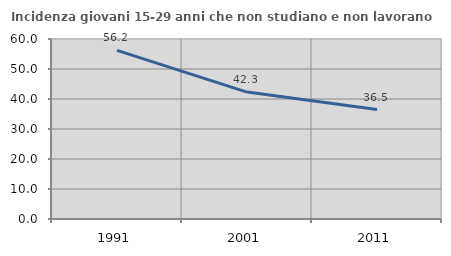
| Category | Incidenza giovani 15-29 anni che non studiano e non lavorano  |
|---|---|
| 1991.0 | 56.199 |
| 2001.0 | 42.308 |
| 2011.0 | 36.475 |